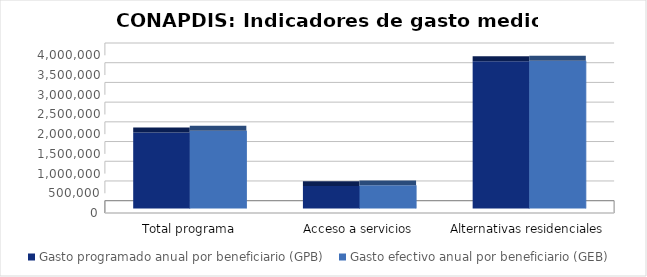
| Category | Gasto programado anual por beneficiario (GPB)  | Gasto efectivo anual por beneficiario (GEB)  |
|---|---|---|
| Total programa | 1926447.507 | 1972613.926 |
| Acceso a servicios | 568109.339 | 587529.184 |
| Alternativas residenciales | 3733448.888 | 3747306.344 |